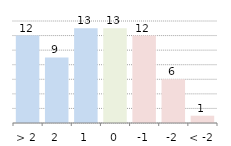
| Category | Series 0 |
|---|---|
| > 2 | 12 |
| 2 | 9 |
| 1 | 13 |
| 0 | 13 |
| -1 | 12 |
| -2 | 6 |
| < -2 | 1 |